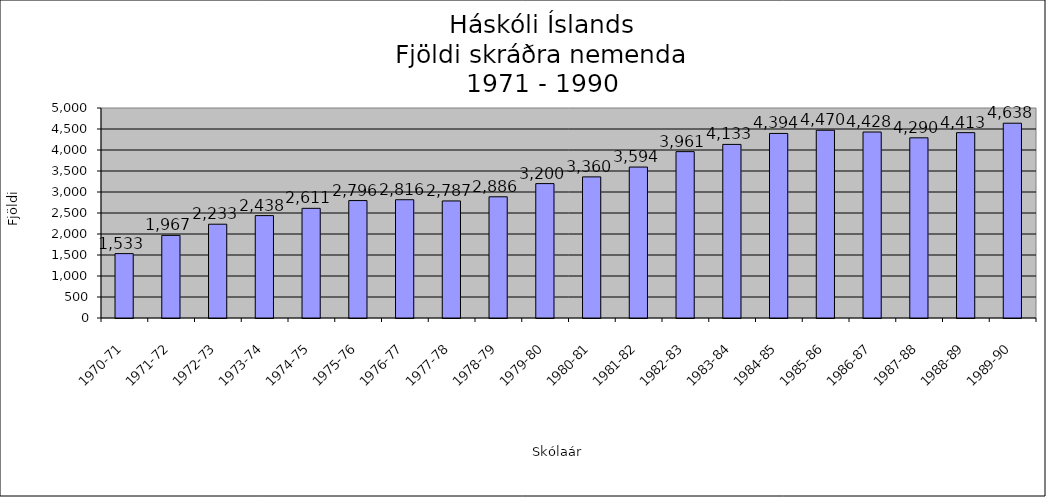
| Category | Series 0 |
|---|---|
| 1970-71 | 1533 |
| 1971-72 | 1967 |
| 1972-73 | 2233 |
| 1973-74 | 2438 |
| 1974-75 | 2611 |
| 1975-76 | 2796 |
| 1976-77 | 2816 |
| 1977-78 | 2787 |
| 1978-79 | 2886 |
| 1979-80 | 3200 |
| 1980-81 | 3360 |
| 1981-82 | 3594 |
| 1982-83 | 3961 |
| 1983-84 | 4133 |
| 1984-85 | 4394 |
| 1985-86 | 4470 |
| 1986-87 | 4428 |
| 1987-88 | 4290 |
| 1988-89 | 4413 |
| 1989-90 | 4638 |